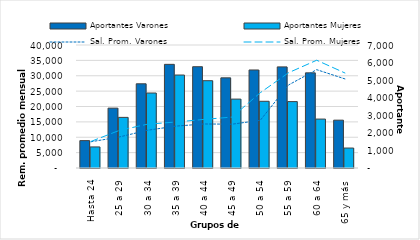
| Category | Aportantes Varones | Aportantes Mujeres |
|---|---|---|
| 0 | 1558 | 1199 |
| 1 | 3407 | 2881 |
| 2 | 4792 | 4268 |
| 3 | 5899 | 5291 |
| 4 | 5764 | 4969 |
| 5 | 5130 | 3921 |
| 6 | 5579 | 3797 |
| 7 | 5755 | 3779 |
| 8 | 5414 | 2785 |
| 9 | 2722 | 1136 |